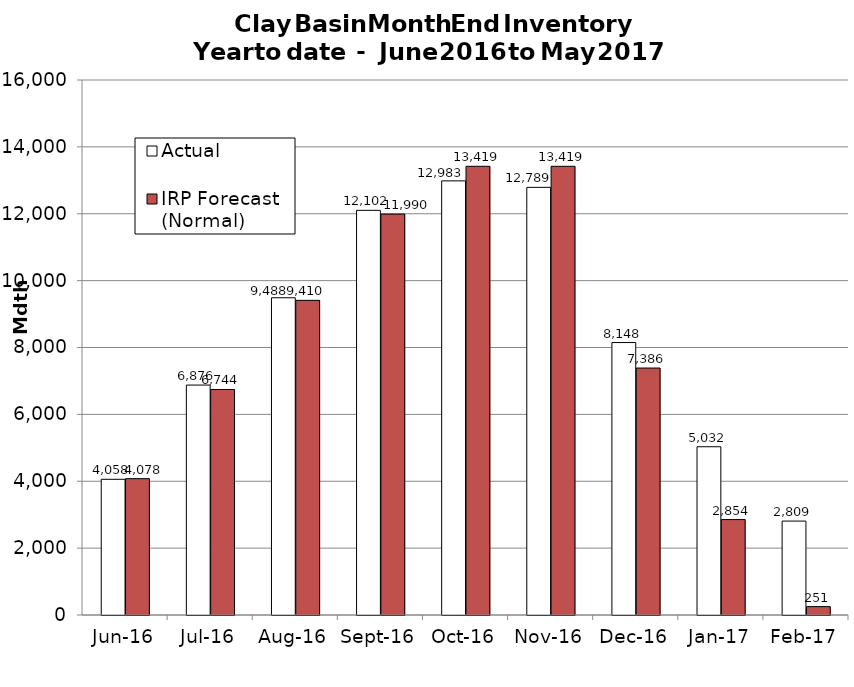
| Category | Actual | IRP Forecast (Normal) |
|---|---|---|
| 2016-06-01 | 4058.094 | 4078 |
| 2016-07-01 | 6876.461 | 6744 |
| 2016-08-01 | 9487.693 | 9410 |
| 2016-09-01 | 12102.064 | 11990 |
| 2016-10-01 | 12982.744 | 13419 |
| 2016-11-01 | 12789.445 | 13419 |
| 2016-12-01 | 8147.765 | 7385.533 |
| 2017-01-01 | 5031.858 | 2854.078 |
| 2017-02-01 | 2808.559 | 250.935 |